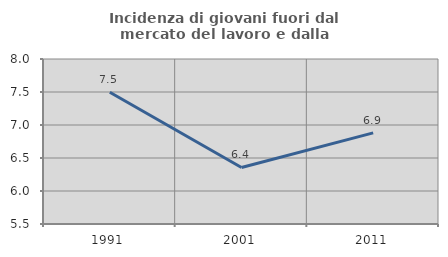
| Category | Incidenza di giovani fuori dal mercato del lavoro e dalla formazione  |
|---|---|
| 1991.0 | 7.495 |
| 2001.0 | 6.357 |
| 2011.0 | 6.881 |